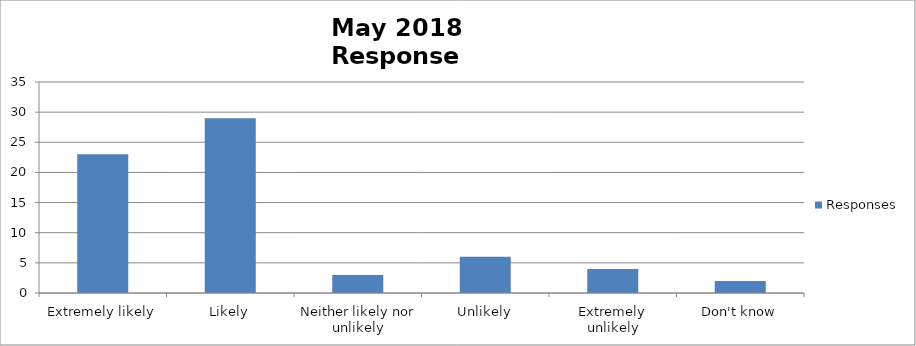
| Category | Responses |
|---|---|
| Extremely likely | 23 |
| Likely | 29 |
| Neither likely nor unlikely | 3 |
| Unlikely | 6 |
| Extremely unlikely | 4 |
| Don't know | 2 |